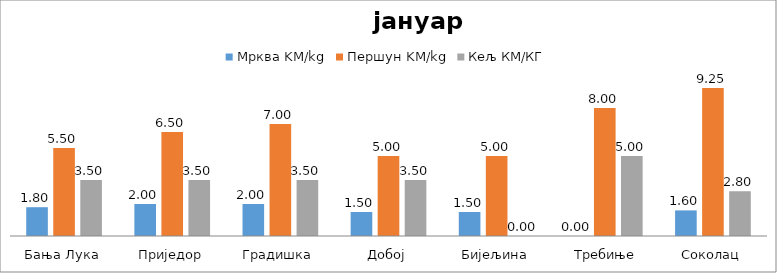
| Category | Мрква KM/kg | Першун KM/kg | Кељ КМ/КГ |
|---|---|---|---|
| Бања Лука | 1.8 | 5.5 | 3.5 |
| Приједор | 2 | 6.5 | 3.5 |
| Градишка | 2 | 7 | 3.5 |
| Добој | 1.5 | 5 | 3.5 |
| Бијељина | 1.5 | 5 | 0 |
|  Требиње | 0 | 8 | 5 |
| Соколац | 1.6 | 9.25 | 2.8 |